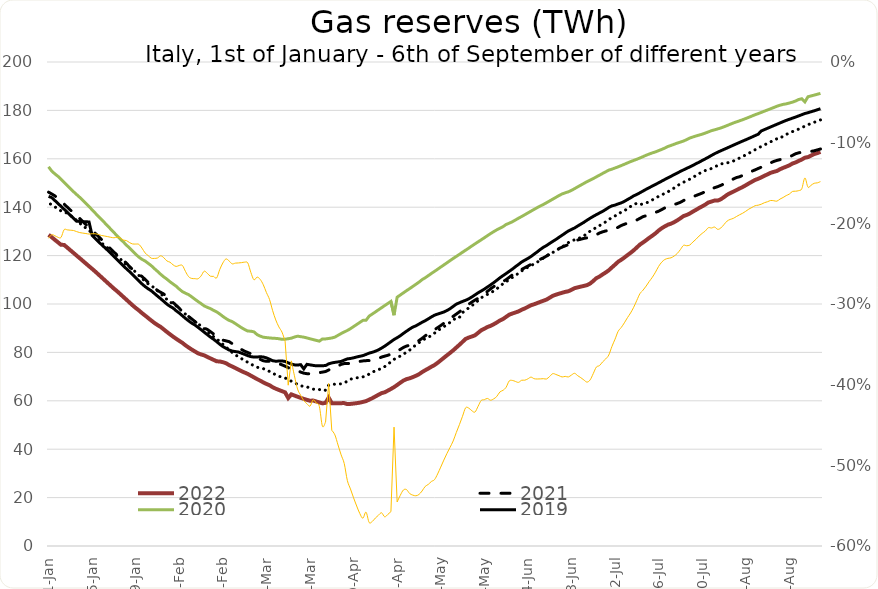
| Category | 2022 | 2021 | 2020 | 2019 | 2018 |
|---|---|---|---|---|---|
| 2022-09-06 | 162.872 | 164.057 | 187.027 | 180.682 | 176.072 |
| 2022-09-05 | 162.35 | 163.673 | 186.674 | 180.272 | 175.582 |
| 2022-09-04 | 161.97 | 163.307 | 186.323 | 179.841 | 175.07 |
| 2022-09-03 | 161.345 | 163.072 | 185.981 | 179.45 | 174.584 |
| 2022-09-02 | 160.709 | 162.993 | 185.655 | 179.056 | 174.094 |
| 2022-09-01 | 160.45 | 162.846 | 183.521 | 178.714 | 173.491 |
| 2022-08-31 | 159.708 | 162.735 | 184.812 | 178.217 | 172.868 |
| 2022-08-30 | 159.123 | 162.465 | 184.497 | 177.726 | 172.266 |
| 2022-08-29 | 158.492 | 162.07 | 183.881 | 177.241 | 171.717 |
| 2022-08-28 | 158.041 | 161.401 | 183.407 | 176.788 | 171.229 |
| 2022-08-27 | 157.29 | 160.776 | 183.045 | 176.327 | 170.656 |
| 2022-08-26 | 156.754 | 160.318 | 182.709 | 175.881 | 170.067 |
| 2022-08-25 | 156.246 | 159.985 | 182.49 | 175.348 | 169.461 |
| 2022-08-24 | 155.674 | 159.661 | 182.134 | 174.805 | 168.328 |
| 2022-08-23 | 154.972 | 159.333 | 181.707 | 174.26 | 168.275 |
| 2022-08-22 | 154.606 | 158.908 | 181.192 | 173.713 | 167.662 |
| 2022-08-21 | 154.208 | 158.325 | 180.684 | 173.164 | 167.028 |
| 2022-08-20 | 153.574 | 157.735 | 180.172 | 172.613 | 166.399 |
| 2022-08-19 | 152.993 | 157.098 | 179.68 | 172.061 | 165.758 |
| 2022-08-18 | 152.321 | 156.551 | 179.172 | 171.511 | 165.11 |
| 2022-08-17 | 151.741 | 155.996 | 178.673 | 170.156 | 164.448 |
| 2022-08-16 | 151.262 | 155.424 | 178.209 | 169.585 | 163.727 |
| 2022-08-15 | 150.541 | 154.879 | 177.681 | 169.002 | 163.019 |
| 2022-08-14 | 149.829 | 154.307 | 177.151 | 168.423 | 162.3 |
| 2022-08-13 | 149.06 | 153.666 | 176.645 | 167.862 | 161.577 |
| 2022-08-12 | 148.337 | 153.137 | 176.149 | 167.32 | 160.97 |
| 2022-08-11 | 147.712 | 152.571 | 175.694 | 166.766 | 160.31 |
| 2022-08-10 | 147.062 | 152.242 | 175.235 | 166.194 | 159.688 |
| 2022-08-09 | 146.415 | 151.635 | 174.796 | 165.623 | 159.051 |
| 2022-08-08 | 145.812 | 151.059 | 174.268 | 165.045 | 158.596 |
| 2022-08-07 | 145.12 | 150.346 | 173.739 | 164.458 | 158.31 |
| 2022-08-06 | 144.162 | 149.635 | 173.219 | 163.886 | 158.111 |
| 2022-08-05 | 143.279 | 149.03 | 172.754 | 163.319 | 157.881 |
| 2022-08-04 | 142.737 | 148.503 | 172.351 | 162.742 | 157.246 |
| 2022-08-03 | 142.758 | 148.064 | 171.973 | 162.112 | 156.64 |
| 2022-08-02 | 142.344 | 147.627 | 171.634 | 161.396 | 156.001 |
| 2022-08-01 | 141.959 | 146.545 | 171.116 | 160.663 | 155.531 |
| 2022-07-31 | 141.071 | 146.464 | 170.629 | 159.973 | 155.137 |
| 2022-07-30 | 140.351 | 145.83 | 170.171 | 159.297 | 154.566 |
| 2022-07-29 | 139.663 | 145.323 | 169.798 | 158.576 | 153.851 |
| 2022-07-28 | 138.897 | 144.826 | 169.428 | 157.964 | 153.069 |
| 2022-07-27 | 138.176 | 144.308 | 169.02 | 157.255 | 152.277 |
| 2022-07-26 | 137.379 | 143.91 | 168.558 | 156.62 | 151.551 |
| 2022-07-25 | 136.782 | 143.47 | 167.932 | 156.052 | 150.955 |
| 2022-07-24 | 136.329 | 142.742 | 167.316 | 155.418 | 150.308 |
| 2022-07-23 | 135.423 | 142.017 | 166.915 | 154.791 | 149.632 |
| 2022-07-22 | 134.559 | 141.524 | 166.497 | 154.108 | 148.869 |
| 2022-07-21 | 133.817 | 141.085 | 166.001 | 153.472 | 147.972 |
| 2022-07-20 | 133.2 | 140.65 | 165.535 | 152.782 | 147.078 |
| 2022-07-19 | 132.765 | 140.2 | 165.084 | 152.121 | 146.388 |
| 2022-07-18 | 132.088 | 139.741 | 164.427 | 151.462 | 145.737 |
| 2022-07-17 | 131.308 | 138.992 | 163.889 | 150.771 | 145.076 |
| 2022-07-16 | 130.341 | 138.35 | 163.374 | 150.081 | 144.449 |
| 2022-07-15 | 129.196 | 137.857 | 162.856 | 149.411 | 143.825 |
| 2022-07-14 | 128.237 | 137.368 | 162.45 | 148.747 | 143.019 |
| 2022-07-13 | 127.342 | 136.888 | 161.981 | 148.074 | 142.207 |
| 2022-07-12 | 126.37 | 136.474 | 161.472 | 147.406 | 141.788 |
| 2022-07-11 | 125.412 | 136.109 | 160.886 | 146.681 | 141.399 |
| 2022-07-10 | 124.56 | 135.384 | 160.334 | 145.961 | 141.074 |
| 2022-07-09 | 123.361 | 134.709 | 159.818 | 145.262 | 141.594 |
| 2022-07-08 | 122.182 | 134.257 | 159.331 | 144.69 | 141.14 |
| 2022-07-07 | 121.145 | 133.802 | 158.835 | 143.877 | 140.301 |
| 2022-07-06 | 120.201 | 133.398 | 158.296 | 143.149 | 139.272 |
| 2022-07-05 | 119.195 | 132.944 | 157.733 | 142.407 | 138.614 |
| 2022-07-04 | 118.281 | 132.436 | 157.207 | 141.792 | 138.076 |
| 2022-07-03 | 117.458 | 131.705 | 156.676 | 141.365 | 136.843 |
| 2022-07-02 | 116.25 | 131.007 | 156.201 | 140.866 | 136.407 |
| 2022-07-01 | 115.113 | 130.516 | 155.713 | 140.563 | 135.792 |
| 2022-06-30 | 113.938 | 130.417 | 155.323 | 139.909 | 134.831 |
| 2022-06-29 | 113.019 | 130.188 | 154.623 | 139.059 | 133.936 |
| 2022-06-28 | 112.217 | 129.804 | 153.942 | 138.255 | 133.166 |
| 2022-06-27 | 111.326 | 129.339 | 153.225 | 137.602 | 132.359 |
| 2022-06-26 | 110.682 | 128.6 | 152.54 | 136.914 | 131.595 |
| 2022-06-25 | 109.508 | 127.922 | 151.815 | 136.207 | 130.894 |
| 2022-06-24 | 108.452 | 127.578 | 151.193 | 135.444 | 130.108 |
| 2022-06-23 | 107.787 | 127.344 | 150.559 | 134.624 | 129.144 |
| 2022-06-22 | 107.475 | 127.108 | 149.839 | 133.753 | 128.13 |
| 2022-06-21 | 107.175 | 126.763 | 149.114 | 132.99 | 127.47 |
| 2022-06-20 | 106.853 | 126.445 | 148.402 | 132.223 | 127.023 |
| 2022-06-19 | 106.544 | 125.748 | 147.662 | 131.401 | 126.538 |
| 2022-06-18 | 105.864 | 125.085 | 146.946 | 130.818 | 125.995 |
| 2022-06-17 | 105.258 | 124.523 | 146.357 | 130.176 | 125.365 |
| 2022-06-16 | 105.01 | 124.033 | 145.936 | 129.304 | 124.459 |
| 2022-06-15 | 104.635 | 123.514 | 145.486 | 128.413 | 123.522 |
| 2022-06-14 | 104.267 | 122.902 | 144.81 | 127.554 | 122.811 |
| 2022-06-13 | 103.844 | 122.205 | 144.068 | 126.667 | 122.025 |
| 2022-06-12 | 103.383 | 121.389 | 143.325 | 125.86 | 121.29 |
| 2022-06-11 | 102.596 | 120.574 | 142.588 | 125.042 | 120.63 |
| 2022-06-10 | 101.836 | 119.816 | 141.853 | 124.162 | 119.957 |
| 2022-06-09 | 101.353 | 119.094 | 141.143 | 123.448 | 118.995 |
| 2022-06-08 | 100.882 | 118.48 | 140.512 | 122.541 | 118.053 |
| 2022-06-07 | 100.378 | 117.828 | 139.823 | 121.531 | 117.295 |
| 2022-06-06 | 99.886 | 117.188 | 139.1 | 120.581 | 116.549 |
| 2022-06-05 | 99.495 | 116.373 | 138.363 | 119.626 | 115.873 |
| 2022-06-04 | 98.809 | 115.669 | 137.62 | 118.808 | 115.182 |
| 2022-06-03 | 98.16 | 114.982 | 136.88 | 118.099 | 114.527 |
| 2022-06-02 | 97.629 | 114.275 | 136.148 | 117.351 | 113.647 |
| 2022-06-01 | 96.947 | 113.483 | 135.449 | 116.356 | 112.704 |
| 2022-05-31 | 96.492 | 112.844 | 134.705 | 115.421 | 111.827 |
| 2022-05-30 | 96.059 | 112.013 | 133.977 | 114.402 | 110.967 |
| 2022-05-29 | 95.584 | 111.018 | 133.379 | 113.492 | 110.1 |
| 2022-05-28 | 94.672 | 110.033 | 132.85 | 112.582 | 109.166 |
| 2022-05-27 | 93.783 | 109.281 | 131.958 | 111.715 | 108.346 |
| 2022-05-26 | 93.183 | 108.714 | 131.302 | 110.819 | 107.307 |
| 2022-05-25 | 92.345 | 108.03 | 130.639 | 109.776 | 106.266 |
| 2022-05-24 | 91.61 | 107.144 | 129.87 | 108.802 | 105.374 |
| 2022-05-23 | 90.958 | 106.264 | 129.092 | 107.883 | 104.586 |
| 2022-05-22 | 90.49 | 105.196 | 128.232 | 107.018 | 103.983 |
| 2022-05-21 | 89.772 | 104.126 | 127.352 | 106.132 | 103.348 |
| 2022-05-20 | 89.124 | 103.231 | 126.521 | 105.369 | 102.546 |
| 2022-05-19 | 88.078 | 102.319 | 125.674 | 104.619 | 101.4 |
| 2022-05-18 | 87.054 | 101.621 | 124.834 | 103.764 | 100.243 |
| 2022-05-17 | 86.562 | 100.796 | 123.984 | 102.91 | 99.354 |
| 2022-05-16 | 86.134 | 99.885 | 123.091 | 102.131 | 98.397 |
| 2022-05-15 | 85.562 | 98.809 | 122.238 | 101.534 | 97.394 |
| 2022-05-14 | 84.343 | 97.741 | 121.388 | 101.056 | 96.45 |
| 2022-05-13 | 83.141 | 96.763 | 120.52 | 100.5 | 94.45 |
| 2022-05-12 | 81.998 | 95.831 | 119.667 | 99.942 | 94.394 |
| 2022-05-11 | 80.837 | 94.904 | 118.813 | 99.001 | 93.343 |
| 2022-05-10 | 79.805 | 93.985 | 117.928 | 98.055 | 92.396 |
| 2022-05-09 | 78.788 | 93.055 | 117.022 | 97.303 | 91.518 |
| 2022-05-08 | 77.761 | 92.051 | 116.136 | 96.676 | 90.624 |
| 2022-05-07 | 76.726 | 91.074 | 115.257 | 96.27 | 89.786 |
| 2022-05-06 | 75.699 | 90.228 | 114.357 | 95.834 | 88.981 |
| 2022-05-05 | 74.766 | 89.363 | 113.476 | 95.376 | 87.946 |
| 2022-05-04 | 74.09 | 88.539 | 112.618 | 94.65 | 86.98 |
| 2022-05-03 | 73.32 | 87.658 | 111.715 | 93.859 | 86.257 |
| 2022-05-02 | 72.615 | 86.828 | 110.823 | 93.074 | 85.643 |
| 2022-05-01 | 71.844 | 85.801 | 110.052 | 92.441 | 84.994 |
| 2022-04-30 | 70.967 | 84.868 | 109.016 | 91.691 | 83.956 |
| 2022-04-29 | 70.32 | 84.199 | 108.133 | 90.967 | 83.076 |
| 2022-04-28 | 69.77 | 83.495 | 107.227 | 90.436 | 81.993 |
| 2022-04-27 | 69.292 | 82.95 | 106.355 | 89.634 | 80.922 |
| 2022-04-26 | 68.952 | 82.618 | 105.501 | 88.756 | 80.023 |
| 2022-04-25 | 68.342 | 82.034 | 104.605 | 87.851 | 79.298 |
| 2022-04-24 | 67.465 | 81.236 | 103.71 | 86.87 | 78.464 |
| 2022-04-23 | 66.532 | 80.411 | 102.819 | 86.074 | 77.93 |
| 2022-04-22 | 65.647 | 79.762 | 95.363 | 85.336 | 77.11 |
| 2022-04-21 | 64.895 | 79.238 | 101.067 | 84.415 | 76.1 |
| 2022-04-20 | 64.196 | 78.807 | 100.2 | 83.484 | 75.102 |
| 2022-04-19 | 63.521 | 78.449 | 99.337 | 82.579 | 74.12 |
| 2022-04-18 | 63.172 | 78.08 | 98.473 | 81.785 | 73.496 |
| 2022-04-17 | 62.491 | 77.477 | 97.6 | 81.049 | 72.836 |
| 2022-04-16 | 61.784 | 76.899 | 96.712 | 80.492 | 72.376 |
| 2022-04-15 | 61.071 | 76.636 | 95.858 | 80.049 | 71.83 |
| 2022-04-14 | 60.462 | 76.613 | 94.979 | 79.697 | 71.047 |
| 2022-04-13 | 59.87 | 76.599 | 93.28 | 79.172 | 70.256 |
| 2022-04-12 | 59.554 | 76.486 | 93.236 | 78.67 | 69.873 |
| 2022-04-11 | 59.234 | 76.282 | 92.388 | 78.393 | 69.696 |
| 2022-04-10 | 59.031 | 75.564 | 91.526 | 78.116 | 69.491 |
| 2022-04-09 | 58.866 | 75.475 | 90.668 | 77.755 | 69.258 |
| 2022-04-08 | 58.72 | 75.434 | 89.8 | 77.491 | 68.911 |
| 2022-04-07 | 58.642 | 75.414 | 89.067 | 77.32 | 68.091 |
| 2022-04-06 | 59.042 | 75.393 | 88.431 | 76.806 | 67.414 |
| 2022-04-05 | 59.036 | 75.037 | 87.788 | 76.266 | 67.02 |
| 2022-04-04 | 59.034 | 74.394 | 87.059 | 76.068 | 66.878 |
| 2022-04-03 | 59.03 | 73.783 | 86.318 | 75.885 | 66.868 |
| 2022-04-02 | 59.012 | 73.179 | 85.952 | 75.649 | 66.773 |
| 2022-04-01 | 61.308 | 72.746 | 85.747 | 75.268 | 66.42 |
| 2022-03-31 | 59.16 | 72.098 | 85.563 | 74.557 | 64.33 |
| 2022-03-30 | 58.945 | 71.85 | 85.57 | 74.51 | 64.835 |
| 2022-03-29 | 59.321 | 71.632 | 84.646 | 74.464 | 64.607 |
| 2022-03-28 | 59.724 | 71.057 | 84.972 | 74.442 | 64.587 |
| 2022-03-27 | 60.119 | 71.096 | 85.298 | 74.638 | 64.835 |
| 2022-03-26 | 60.022 | 71.135 | 85.629 | 74.856 | 65.258 |
| 2022-03-25 | 60.402 | 71.201 | 85.985 | 75.064 | 65.756 |
| 2022-03-24 | 60.787 | 71.431 | 86.3 | 73.199 | 65.894 |
| 2022-03-23 | 61.212 | 71.872 | 86.5 | 74.935 | 66.233 |
| 2022-03-22 | 61.689 | 72.395 | 86.702 | 74.783 | 66.805 |
| 2022-03-21 | 62.172 | 72.916 | 86.356 | 74.848 | 67.438 |
| 2022-03-20 | 62.66 | 73.195 | 85.878 | 75.2 | 68.102 |
| 2022-03-19 | 61.152 | 73.68 | 85.652 | 75.678 | 68.768 |
| 2022-03-18 | 63.49 | 74.314 | 85.46 | 76.261 | 69.43 |
| 2022-03-17 | 63.977 | 74.853 | 85.403 | 76.482 | 69.757 |
| 2022-03-16 | 64.481 | 75.326 | 85.656 | 76.428 | 70.12 |
| 2022-03-15 | 65.002 | 75.852 | 85.789 | 76.348 | 70.687 |
| 2022-03-14 | 65.624 | 76.331 | 85.853 | 76.555 | 71.486 |
| 2022-03-13 | 66.428 | 76.322 | 85.987 | 77.179 | 72.133 |
| 2022-03-12 | 66.974 | 76.318 | 86.117 | 77.746 | 72.67 |
| 2022-03-11 | 67.6 | 76.536 | 86.269 | 78.1 | 73.292 |
| 2022-03-10 | 68.318 | 77.125 | 86.73 | 78.223 | 73.562 |
| 2022-03-09 | 68.959 | 77.754 | 87.348 | 78.092 | 73.877 |
| 2022-03-08 | 69.676 | 78.597 | 88.487 | 78.078 | 74.482 |
| 2022-03-07 | 70.396 | 79.446 | 88.764 | 78.246 | 75.171 |
| 2022-03-06 | 71.113 | 79.959 | 88.822 | 78.648 | 75.917 |
| 2022-03-05 | 71.677 | 80.49 | 89.46 | 79.19 | 76.656 |
| 2022-03-04 | 72.236 | 81.173 | 90.202 | 79.665 | 77.402 |
| 2022-03-03 | 72.896 | 81.993 | 91.055 | 80.162 | 78.207 |
| 2022-03-02 | 73.564 | 82.807 | 91.907 | 80.335 | 79.02 |
| 2022-03-01 | 74.172 | 83.626 | 92.734 | 80.567 | 79.958 |
| 2022-02-28 | 74.779 | 84.449 | 93.221 | 80.993 | 81.094 |
| 2022-02-27 | 75.546 | 84.77 | 93.991 | 81.7 | 82.226 |
| 2022-02-26 | 75.96 | 85.064 | 94.883 | 82.412 | 83.354 |
| 2022-02-25 | 76.254 | 85.835 | 95.871 | 83.378 | 84.485 |
| 2022-02-24 | 76.321 | 86.72 | 96.752 | 84.451 | 85.57 |
| 2022-02-23 | 76.935 | 87.634 | 97.381 | 85.453 | 86.494 |
| 2022-02-22 | 77.528 | 88.587 | 98.115 | 86.335 | 87.588 |
| 2022-02-21 | 78.14 | 89.504 | 98.613 | 87.351 | 88.681 |
| 2022-02-20 | 78.788 | 90.009 | 99.22 | 88.35 | 89.776 |
| 2022-02-19 | 79.162 | 90.783 | 100.156 | 89.382 | 90.844 |
| 2022-02-18 | 79.639 | 91.767 | 101.04 | 90.386 | 91.912 |
| 2022-02-17 | 80.402 | 92.793 | 101.992 | 91.352 | 92.722 |
| 2022-02-16 | 81.181 | 93.818 | 102.964 | 92.091 | 93.675 |
| 2022-02-15 | 82.035 | 94.844 | 103.864 | 93.044 | 94.704 |
| 2022-02-14 | 82.911 | 95.868 | 104.443 | 94.03 | 95.78 |
| 2022-02-13 | 83.946 | 97.051 | 105.12 | 95.142 | 96.916 |
| 2022-02-12 | 84.77 | 98.249 | 106.149 | 96.255 | 98.051 |
| 2022-02-11 | 85.626 | 99.46 | 107.33 | 97.198 | 99.213 |
| 2022-02-10 | 86.522 | 100.609 | 108.275 | 98.329 | 100.017 |
| 2022-02-09 | 87.49 | 101.784 | 109.201 | 99.057 | 100.856 |
| 2022-02-08 | 88.476 | 102.984 | 110.292 | 99.964 | 101.922 |
| 2022-02-07 | 89.513 | 104.141 | 111.218 | 101.106 | 103.092 |
| 2022-02-06 | 90.544 | 104.854 | 112.299 | 102.215 | 104.305 |
| 2022-02-05 | 91.314 | 105.569 | 113.498 | 103.272 | 105.516 |
| 2022-02-04 | 92.19 | 106.702 | 114.636 | 104.371 | 106.685 |
| 2022-02-03 | 93.178 | 107.831 | 115.839 | 105.469 | 107.489 |
| 2022-02-02 | 94.214 | 108.964 | 116.821 | 106.291 | 108.325 |
| 2022-02-01 | 95.256 | 110.19 | 117.798 | 107.228 | 109.387 |
| 2022-01-31 | 96.259 | 111.411 | 118.46 | 108.318 | 110.556 |
| 2022-01-30 | 97.384 | 112.082 | 119.396 | 109.587 | 111.81 |
| 2022-01-29 | 98.365 | 112.944 | 120.565 | 110.875 | 113.095 |
| 2022-01-28 | 99.469 | 114.198 | 121.904 | 112.137 | 114.405 |
| 2022-01-27 | 100.629 | 115.531 | 123.15 | 113.423 | 115.252 |
| 2022-01-26 | 101.806 | 116.871 | 124.346 | 114.577 | 116.195 |
| 2022-01-25 | 102.969 | 118.113 | 125.695 | 115.823 | 117.44 |
| 2022-01-24 | 104.146 | 119.375 | 126.855 | 117.106 | 118.684 |
| 2022-01-23 | 105.306 | 120.334 | 128.189 | 118.395 | 119.969 |
| 2022-01-22 | 106.374 | 121.416 | 129.553 | 119.665 | 121.263 |
| 2022-01-21 | 107.535 | 122.658 | 130.905 | 120.946 | 122.49 |
| 2022-01-20 | 108.709 | 123.998 | 132.242 | 122.209 | 123.18 |
| 2022-01-19 | 109.89 | 125.311 | 133.597 | 123.387 | 124.127 |
| 2022-01-18 | 111.066 | 126.62 | 134.953 | 124.551 | 125.306 |
| 2022-01-17 | 112.235 | 127.96 | 136.229 | 125.826 | 126.553 |
| 2022-01-16 | 113.414 | 129.185 | 137.56 | 127.056 | 127.862 |
| 2022-01-15 | 114.538 | 130.308 | 138.918 | 128.326 | 129.184 |
| 2022-01-14 | 115.612 | 131.573 | 140.272 | 133.897 | 130.45 |
| 2022-01-13 | 116.724 | 132.838 | 141.542 | 133.992 | 131.392 |
| 2022-01-12 | 117.832 | 134.071 | 142.825 | 134.041 | 132.283 |
| 2022-01-11 | 118.944 | 135.341 | 144.095 | 134.116 | 133.405 |
| 2022-01-10 | 120.019 | 136.613 | 145.25 | 134.213 | 134.565 |
| 2022-01-09 | 121.129 | 137.667 | 146.43 | 135.436 | 135.58 |
| 2022-01-08 | 122.224 | 138.85 | 147.711 | 136.684 | 136.587 |
| 2022-01-07 | 123.327 | 140.043 | 148.989 | 137.932 | 137.505 |
| 2022-01-06 | 124.41 | 141.31 | 150.269 | 139.158 | 138.023 |
| 2022-01-05 | 124.47 | 142.426 | 151.54 | 140.373 | 138.476 |
| 2022-01-04 | 125.514 | 143.691 | 152.783 | 141.587 | 139.292 |
| 2022-01-03 | 126.552 | 144.704 | 153.801 | 142.797 | 140.168 |
| 2022-01-02 | 127.629 | 145.488 | 154.962 | 143.982 | 141.031 |
| 2022-01-01 | 128.603 | 146.22 | 156.704 | 144.462 | 141.708 |